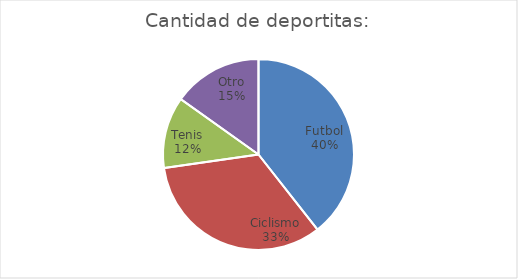
| Category | Cantidad de deportitas: |
|---|---|
| Futbol | 13 |
| Ciclismo | 11 |
| Tenis | 4 |
| Otro | 5 |